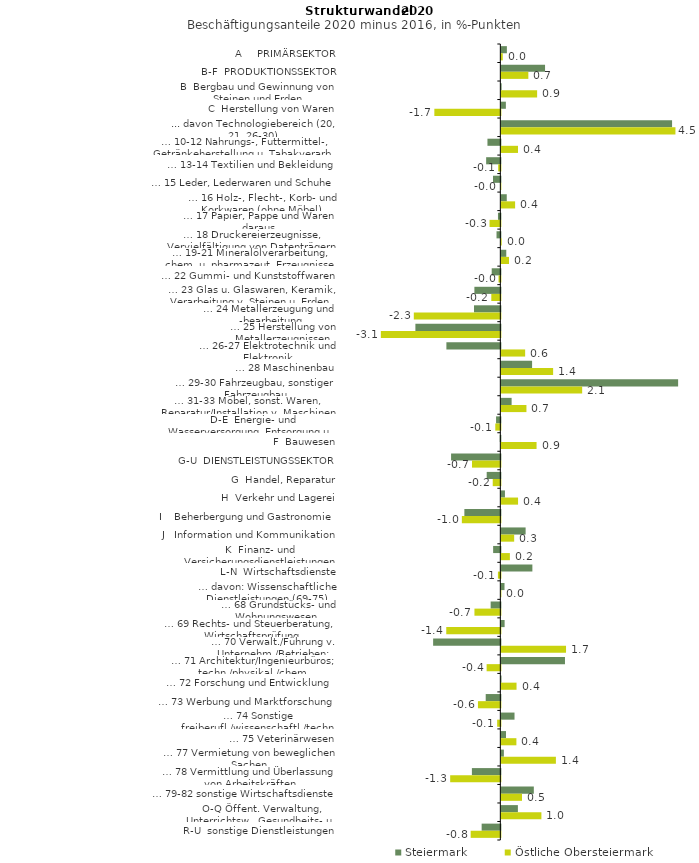
| Category | Steiermark | Östliche Obersteiermark |
|---|---|---|
| A     PRIMÄRSEKTOR | 0.145 | 0.037 |
| B-F  PRODUKTIONSSEKTOR | 1.14 | 0.705 |
| B  Bergbau und Gewinnung von Steinen und Erden | 0.008 | 0.934 |
| C  Herstellung von Waren | 0.118 | -1.721 |
| ... davon Technologiebereich (20, 21, 26-30) | 4.454 | 4.542 |
| … 10-12 Nahrungs-, Futtermittel-, Getränkeherstellung u. Tabakverarb. | -0.336 | 0.435 |
| … 13-14 Textilien und Bekleidung | -0.37 | -0.057 |
| … 15 Leder, Lederwaren und Schuhe | -0.191 | 0 |
| … 16 Holz-, Flecht-, Korb- und Korkwaren (ohne Möbel)  | 0.142 | 0.359 |
| … 17 Papier, Pappe und Waren daraus  | -0.062 | -0.281 |
| … 18 Druckereierzeugnisse, Vervielfältigung von Datenträgern | -0.099 | 0.009 |
| … 19-21 Mineralölverarbeitung, chem. u. pharmazeut. Erzeugnisse | 0.129 | 0.2 |
| … 22 Gummi- und Kunststoffwaren | -0.225 | -0.047 |
| … 23 Glas u. Glaswaren, Keramik, Verarbeitung v. Steinen u. Erden  | -0.677 | -0.236 |
| … 24 Metallerzeugung und -bearbeitung | -0.687 | -2.257 |
| … 25 Herstellung von Metallerzeugnissen  | -2.216 | -3.117 |
| … 26-27 Elektrotechnik und Elektronik | -1.407 | 0.621 |
| … 28 Maschinenbau | 0.802 | 1.351 |
| … 29-30 Fahrzeugbau, sonstiger Fahrzeugbau | 4.612 | 2.109 |
| … 31-33 Möbel, sonst. Waren, Reparatur/Installation v. Maschinen | 0.268 | 0.655 |
| D-E  Energie- und Wasserversorgung, Entsorgung u. Rückgewinnung | -0.111 | -0.132 |
| F  Bauwesen | -0.015 | 0.919 |
| G-U  DIENSTLEISTUNGSSEKTOR | -1.285 | -0.74 |
| G  Handel, Reparatur | -0.356 | -0.198 |
| H  Verkehr und Lagerei | 0.094 | 0.436 |
| I    Beherbergung und Gastronomie | -0.938 | -1.004 |
| J   Information und Kommunikation | 0.633 | 0.335 |
| K  Finanz- und Versicherungsdienstleistungen | -0.188 | 0.223 |
| L-N  Wirtschaftsdienste | 0.81 | -0.063 |
| … davon: Wissenschaftliche Dienstleistungen (69-75) | 0.083 | 0.001 |
| … 68 Grundstücks- und Wohnungswesen  | -0.253 | -0.675 |
| … 69 Rechts- und Steuerberatung, Wirtschaftsprüfung | 0.086 | -1.411 |
| … 70 Verwalt./Führung v. Unternehm./Betrieben; Unternehmensberat. | -1.753 | 1.688 |
| … 71 Architektur/Ingenieurbüros; techn./physikal./chem. Untersuchung | 1.66 | -0.358 |
| … 72 Forschung und Entwicklung  | 0.004 | 0.397 |
| … 73 Werbung und Marktforschung | -0.382 | -0.584 |
| … 74 Sonstige freiberufl./wissenschaftl./techn. Tätigkeiten | 0.344 | -0.083 |
| … 75 Veterinärwesen | 0.121 | 0.393 |
| … 77 Vermietung von beweglichen Sachen  | 0.066 | 1.423 |
| … 78 Vermittlung und Überlassung von Arbeitskräften | -0.742 | -1.308 |
| … 79-82 sonstige Wirtschaftsdienste | 0.848 | 0.539 |
| O-Q Öffent. Verwaltung, Unterrichtsw., Gesundheits- u. Sozialwesen | 0.432 | 1.045 |
| R-U  sonstige Dienstleistungen | -0.488 | -0.774 |